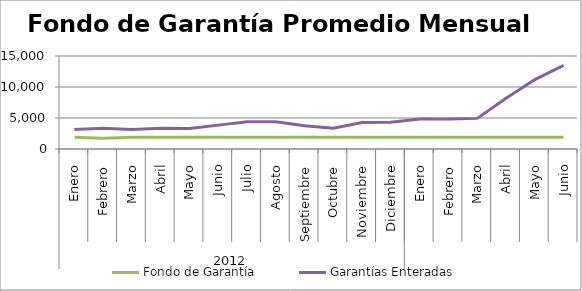
| Category | Fondo de Garantía | Garantías Enteradas |
|---|---|---|
| 0 | 1896.798 | 3141.641 |
| 1 | 1714.423 | 3362.648 |
| 2 | 1900.513 | 3154.118 |
| 3 | 1900.513 | 3348.058 |
| 4 | 1898.685 | 3308.859 |
| 5 | 1900.513 | 3850.375 |
| 6 | 1900.513 | 4400.539 |
| 7 | 1895.388 | 4383.327 |
| 8 | 1900.513 | 3757.632 |
| 9 | 1900.513 | 3362.932 |
| 10 | 1900.311 | 4285.609 |
| 11 | 1890.98 | 4296.87 |
| 12 | 1898.667 | 4842.786 |
| 13 | 1900.512 | 4845.136 |
| 14 | 1900.513 | 4938.365 |
| 15 | 1900.513 | 8179.666 |
| 16 | 1900.513 | 11202.213 |
| 17 | 1900.513 | 13493.433 |